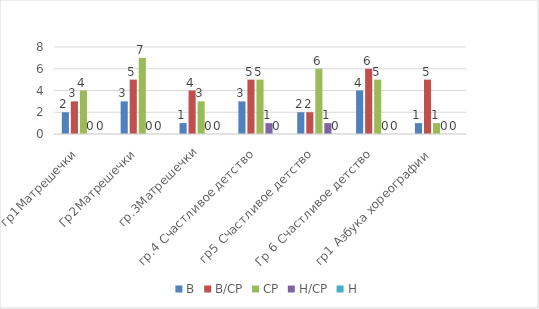
| Category | В | В/СР | СР | Н/СР | Н |
|---|---|---|---|---|---|
| гр1Матрешечки  | 2 | 3 | 4 | 0 | 0 |
| Гр2Матрешечки  | 3 | 5 | 7 | 0 | 0 |
| гр.3Матрешечки | 1 | 4 | 3 | 0 | 0 |
| гр.4 Счастливое детство  | 3 | 5 | 5 | 1 | 0 |
| гр5 Счастливое детство  | 2 | 2 | 6 | 1 | 0 |
| Гр 6 Счастливое детство  | 4 | 6 | 5 | 0 | 0 |
| гр1 Азбука хореографии  | 1 | 5 | 1 | 0 | 0 |